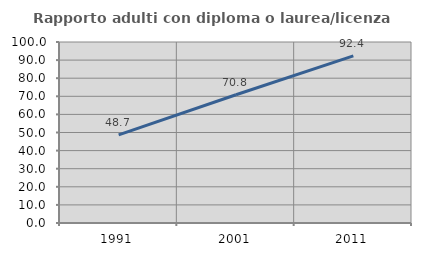
| Category | Rapporto adulti con diploma o laurea/licenza media  |
|---|---|
| 1991.0 | 48.722 |
| 2001.0 | 70.833 |
| 2011.0 | 92.363 |